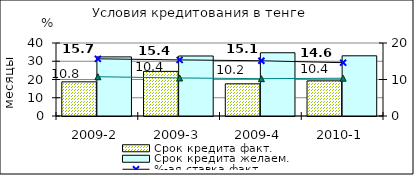
| Category | Срок кредита факт.  | Срок кредита желаем. |
|---|---|---|
| 2009-2 | 18.72 | 32.39 |
| 2009-3 | 24.46 | 32.88 |
| 2009-4 | 17.63 | 34.65 |
| 2010-1 | 19.26 | 32.98 |